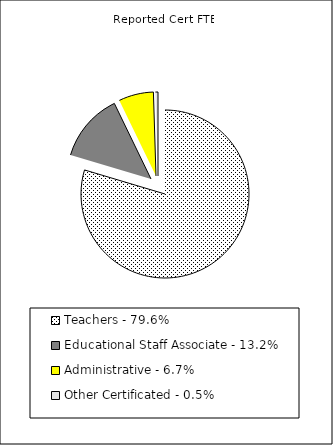
| Category | Reported FTE |
|---|---|
| Teachers - 79.6% | 63451.96 |
| Educational Staff Associate - 13.2% | 10513.69 |
| Administrative - 6.7% | 5333.54 |
| Other Certificated - 0.5% | 393.17 |